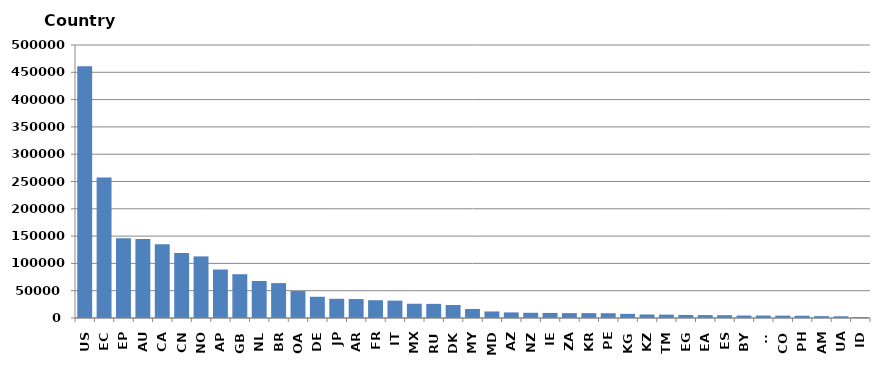
| Category | Series 0 |
|---|---|
| US | 461240 |
| EC | 257507 |
| EP | 146139 |
| AU | 144728 |
| CA | 135151 |
| CN | 119043 |
| NO | 112809 |
| AP | 88793 |
| GB | 80153 |
| NL | 67767 |
| BR | 63928 |
| OA | 49361 |
| DE | 38887 |
| JP | 35197 |
| AR | 34698 |
| FR | 32565 |
| IT | 31825 |
| MX | 26116 |
| RU | 25891 |
| DK | 23778 |
| MY | 16545 |
| MD | 11998 |
| AZ | 10212 |
| NZ | 9540 |
| IE | 9296 |
| ZA | 8938 |
| KR | 8911 |
| PE | 8746 |
| KG | 7570 |
| KZ | 6458 |
| TM | 6189 |
| EG | 5582 |
| EA | 5324 |
| ES | 5122 |
| BY | 4510 |
| TJ | 4498 |
| CO | 4306 |
| PH | 4151 |
| AM | 3440 |
| UA | 3131 |
| ID | 1721 |